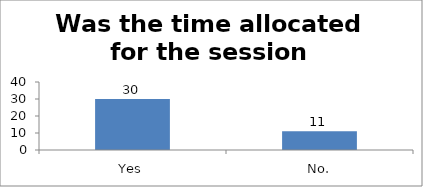
| Category | Was the time allocated for the session sufficient? |
|---|---|
| Yes | 30 |
| No. | 11 |